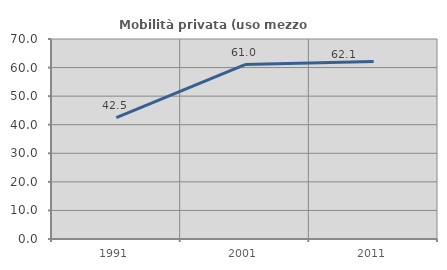
| Category | Mobilità privata (uso mezzo privato) |
|---|---|
| 1991.0 | 42.468 |
| 2001.0 | 61.041 |
| 2011.0 | 62.147 |